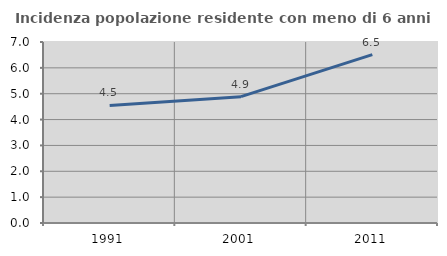
| Category | Incidenza popolazione residente con meno di 6 anni |
|---|---|
| 1991.0 | 4.545 |
| 2001.0 | 4.887 |
| 2011.0 | 6.513 |